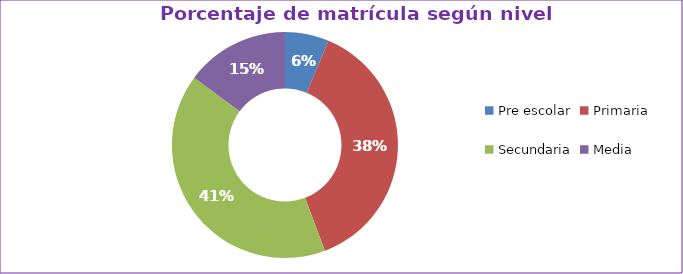
| Category | Series 0 |
|---|---|
| Pre escolar | 0.063 |
| Primaria | 0.38 |
| Secundaria | 0.409 |
| Media | 0.148 |